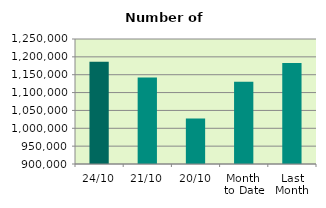
| Category | Series 0 |
|---|---|
| 24/10 | 1186522 |
| 21/10 | 1142500 |
| 20/10 | 1027266 |
| Month 
to Date | 1130644.875 |
| Last
Month | 1182612.273 |